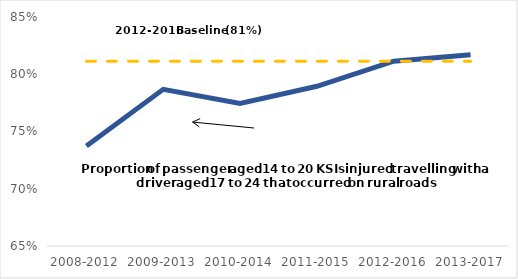
| Category | Series 0 | Series 2 |
|---|---|---|
| 2008-2012 | 0.737 | 0.811 |
| 2009-2013 | 0.787 | 0.811 |
| 2010-2014 | 0.775 | 0.811 |
| 2011-2015 | 0.789 | 0.811 |
| 2012-2016 | 0.811 | 0.811 |
| 2013-2017 | 0.817 | 0.811 |